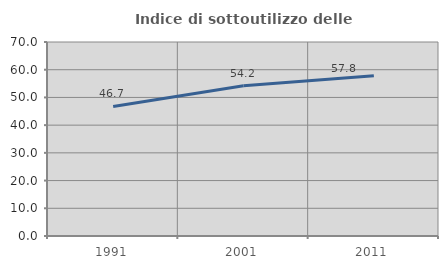
| Category | Indice di sottoutilizzo delle abitazioni  |
|---|---|
| 1991.0 | 46.747 |
| 2001.0 | 54.184 |
| 2011.0 | 57.842 |